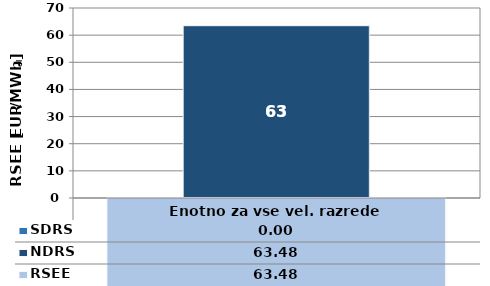
| Category | NDRS | SDRS |
|---|---|---|
| 0 | 63.48 | 0 |